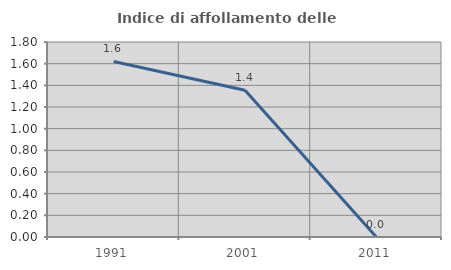
| Category | Indice di affollamento delle abitazioni  |
|---|---|
| 1991.0 | 1.62 |
| 2001.0 | 1.354 |
| 2011.0 | 0 |